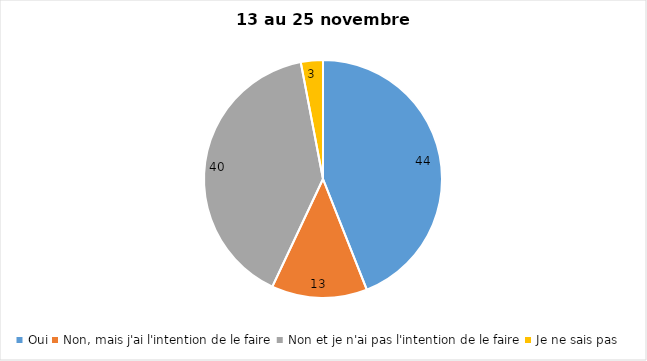
| Category | Series 0 |
|---|---|
| Oui | 44 |
| Non, mais j'ai l'intention de le faire | 13 |
| Non et je n'ai pas l'intention de le faire | 40 |
| Je ne sais pas | 3 |